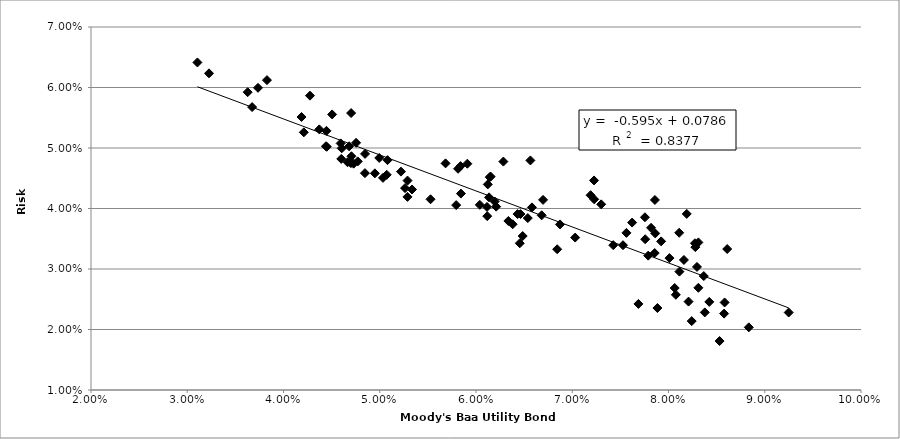
| Category | Series 0 |
|---|---|
| 0.0861 | 0.033 |
| 0.08310327868852461 | 0.034 |
| 0.08111269841269836 | 0.036 |
| 0.07622380952380951 | 0.038 |
| 0.07562857142857143 | 0.036 |
| 0.07856507936507935 | 0.033 |
| 0.08577741935483871 | 0.023 |
| 0.08834516129032259 | 0.02 |
| 0.09249032258064517 | 0.023 |
| 0.0831047619047619 | 0.027 |
| 0.08113174603174601 | 0.03 |
| 0.07755322580645158 | 0.039 |
| 0.07862131147540988 | 0.036 |
| 0.08423809523809522 | 0.025 |
| 0.08366718750000005 | 0.029 |
| 0.08009836065573771 | 0.032 |
| 0.08160333333333332 | 0.031 |
| 0.08274687500000003 | 0.034 |
| 0.07858906250000001 | 0.041 |
| 0.07527166666666667 | 0.034 |
| 0.07300793650793654 | 0.041 |
| 0.0719015625 | 0.042 |
| 0.07226290322580643 | 0.045 |
| 0.07425901639344261 | 0.034 |
| 0.07757968750000002 | 0.035 |
| 0.08240952380952381 | 0.021 |
| 0.0837730158730159 | 0.023 |
| 0.0858301587301587 | 0.024 |
| 0.08295873015873015 | 0.03 |
| 0.08189322033898304 | 0.039 |
| 0.07923500000000001 | 0.035 |
| 0.08064603174603173 | 0.027 |
| 0.0807627118644068 | 0.026 |
| 0.08208499999999999 | 0.025 |
| 0.08278906249999995 | 0.034 |
| 0.07818750000000001 | 0.037 |
| 0.07789193548387098 | 0.032 |
| 0.07228524590163932 | 0.042 |
| 0.06565238095238096 | 0.048 |
| 0.06872812499999997 | 0.037 |
| 0.06697213114754097 | 0.041 |
| 0.0628451612903226 | 0.048 |
| 0.0668241935483871 | 0.039 |
| 0.06461875 | 0.039 |
| 0.06143225806451611 | 0.045 |
| 0.059099999999999986 | 0.047 |
| 0.058395312499999984 | 0.047 |
| 0.05813437500000001 | 0.047 |
| 0.06135714285714287 | 0.042 |
| 0.06151129032258064 | 0.045 |
| 0.06581428571428571 | 0.04 |
| 0.06432063492063489 | 0.039 |
| 0.0611435483870968 | 0.04 |
| 0.06122419354838708 | 0.044 |
| 0.0633625 | 0.038 |
| 0.06485079365079366 | 0.035 |
| 0.06380806451612903 | 0.037 |
| 0.06538196721311473 | 0.038 |
| 0.06843437500000002 | 0.033 |
| 0.0703046875 | 0.035 |
| 0.08530645161290325 | 0.018 |
| 0.07884918032786886 | 0.024 |
| 0.07687460317460318 | 0.024 |
| 0.064546875 | 0.034 |
| 0.06194354838709676 | 0.041 |
| 0.06209508196721309 | 0.04 |
| 0.061168749999999994 | 0.039 |
| 0.056839062499999995 | 0.047 |
| 0.058434920634920624 | 0.042 |
| 0.060396774193548365 | 0.041 |
| 0.05793809523809524 | 0.041 |
| 0.0533546875 | 0.043 |
| 0.05080819672131149 | 0.048 |
| 0.0507274193548387 | 0.046 |
| 0.049946875 | 0.048 |
| 0.04847460317460319 | 0.049 |
| 0.04505245901639345 | 0.056 |
| 0.047060000000000005 | 0.049 |
| 0.04728750000000002 | 0.047 |
| 0.052629687499999994 | 0.043 |
| 0.05220483870967743 | 0.046 |
| 0.0503344262295082 | 0.045 |
| 0.04754126984126983 | 0.051 |
| 0.04700312499999999 | 0.047 |
| 0.04702539682539684 | 0.056 |
| 0.04449836065573771 | 0.05 |
| 0.04845781250000001 | 0.046 |
| 0.052885937499999994 | 0.045 |
| 0.05527580645161292 | 0.042 |
| 0.05288032786885245 | 0.042 |
| 0.04600312500000002 | 0.048 |
| 0.0421109375 | 0.053 |
| 0.045939999999999995 | 0.051 |
| 0.04604838709677418 | 0.05 |
| 0.044412698412698424 | 0.05 |
| 0.04275000000000001 | 0.059 |
| 0.0418741935483871 | 0.055 |
| 0.04371967213114754 | 0.053 |
| 0.046657812499999986 | 0.048 |
| 0.046822222222222216 | 0.05 |
| 0.04949354838709676 | 0.046 |
| 0.04771666666666665 | 0.048 |
| 0.04446190476190477 | 0.053 |
| 0.038281249999999996 | 0.061 |
| 0.03735 | 0.06 |
| 0.03673870967741935 | 0.057 |
| 0.03627619047619048 | 0.059 |
| 0.0310578125 | 0.064 |
| 0.032260000000000004 | 0.062 |